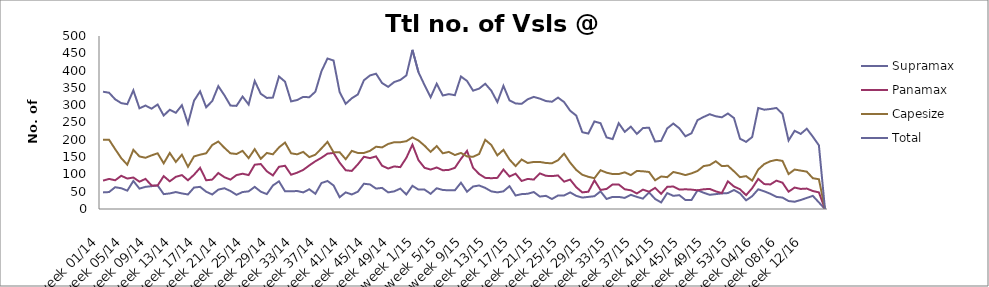
| Category | Supramax | Panamax | Capesize | Total |
|---|---|---|---|---|
| week 01/14 | 48 | 82 | 200 | 339 |
| week 02/14 | 49 | 87 | 200 | 336 |
| week 03/14 | 63 | 83 | 173 | 317 |
| week 04/14 | 60 | 96 | 147 | 306 |
| week 05/14 | 53 | 88 | 128 | 303 |
| week 06/14 | 81 | 91 | 171 | 343 |
| week 07/14 | 59 | 79 | 152 | 291 |
| week 08/14 | 64 | 87 | 148 | 299 |
| week 09/14 | 66 | 68 | 155 | 290 |
| week 10/14 | 68 | 68 | 161 | 302 |
| week 11/14 | 43 | 95 | 132 | 270 |
| week 12/14 | 45 | 80 | 162 | 287 |
| week 13/14 | 49 | 93 | 136 | 278 |
| week 14/14 | 45 | 98 | 157 | 300 |
| week 15/14 | 42 | 83 | 122 | 247 |
| week 16/14 | 62 | 99 | 152 | 313 |
| week 17/14 | 64 | 119 | 157 | 340 |
| week 18/14 | 50 | 83 | 161 | 294 |
| week 19/14 | 42 | 85 | 185 | 312 |
| week 20/14 | 56 | 104 | 195 | 355 |
| week 21/14 | 60 | 92 | 177 | 329 |
| week 22/14 | 52 | 85 | 161 | 299 |
| week 23/14 | 41 | 98 | 159 | 298 |
| week 24/14 | 49 | 102 | 168 | 325 |
| week 25/14 | 51 | 98 | 147 | 302 |
| week 26/14 | 64 | 128 | 173 | 370 |
| week 27/14 | 50 | 130 | 145 | 333 |
| week 28/14 | 43 | 109 | 162 | 321 |
| week 29/14 | 68 | 97 | 158 | 322 |
| week 30/14 | 80 | 122 | 178 | 383 |
| week 31/14 | 51 | 125 | 192 | 368 |
| week 32/14 | 51 | 99 | 161 | 311 |
| week 33/14 | 52 | 105 | 158 | 315 |
| week 34/14 | 48 | 113 | 165 | 324 |
| week 35/14 | 57 | 126 | 150 | 323 |
| week 36/14 | 44 | 138 | 157 | 339 |
| week 37/14 | 75 | 148 | 175 | 398 |
| week 38/14 | 81 | 160 | 194 | 435 |
| week 39/14 | 68 | 162 | 164 | 429 |
| week 40/14 | 34 | 134 | 164 | 338 |
| week 41/14 | 48 | 112 | 144 | 304 |
| week 42/14 | 42 | 110 | 168 | 320 |
| week 43/14 | 50 | 129 | 162 | 331 |
| week 44/14 | 73 | 151 | 162 | 372 |
| week 45/14 | 71 | 147 | 168 | 386 |
| week 46/14 | 59 | 152 | 180 | 391 |
| week 47/14 | 61 | 125 | 178 | 364 |
| week 48/14 | 48 | 117 | 188 | 353 |
| week 49/14 | 51 | 123 | 193 | 367 |
| week 50/14 | 59 | 121 | 193 | 373 |
| week 51/14 | 42 | 148 | 196 | 386 |
| week 52/14 | 67 | 186 | 207 | 460 |
| week 1/15 | 56 | 141 | 198 | 395 |
| week 2/15 | 56 | 119 | 183 | 358 |
| week 3/15 | 44 | 114 | 165 | 323 |
| week 4/15 | 60 | 120 | 182 | 362 |
| week 5/15 | 55 | 112 | 161 | 328 |
| week 6/15 | 54 | 113 | 165 | 332 |
| week 7/15 | 54 | 119 | 156 | 329 |
| week 8/15 | 76 | 145 | 162 | 383 |
| week 9/15 | 50 | 168 | 152 | 370 |
| week 10/15 | 65 | 119 | 151 | 342 |
| week 11/15 | 68 | 101 | 159 | 348 |
| week 12/15 | 61 | 90 | 200 | 362 |
| week 13/15 | 51 | 89 | 185 | 342 |
| week 14/15 | 48 | 90 | 155 | 309 |
| week 15/15 | 51 | 114 | 171 | 356 |
| week 16/15 | 66 | 94 | 143 | 314 |
| week 17/15 | 39 | 102 | 124 | 305 |
| week 18/15 | 43 | 81 | 143 | 304 |
| week 19/15 | 44 | 87 | 133 | 317 |
| week 20/15 | 49 | 85 | 136 | 324 |
| week 21/15 | 36 | 103 | 136 | 319 |
| week 22/15 | 38 | 96 | 133 | 312 |
| week 23/15 | 29 | 95 | 132 | 310 |
| week 24/15 | 39 | 97 | 141 | 322 |
| week 25/15 | 39 | 79 | 160 | 309 |
| week 26/15 | 48 | 85 | 134 | 284 |
| week 27/15 | 38 | 63 | 113 | 270 |
| week 28/15 | 33 | 48 | 99 | 222 |
| week 29/15 | 35 | 50 | 93 | 218 |
| week 30/15 | 37 | 83 | 89 | 253 |
| week 31/15 | 51 | 55 | 112 | 248 |
| week 32/15 | 29 | 58 | 105 | 207 |
| week 33/15 | 35 | 71 | 101 | 202 |
| week 34/15 | 35 | 71 | 101 | 248 |
| week 35/15 | 32 | 57 | 106 | 223 |
| week 36/15 | 41 | 54 | 98 | 238 |
| week 37/15 | 35 | 45 | 110 | 217 |
| week 38/15 | 30 | 56 | 109 | 234 |
| week 39/15 | 48 | 50 | 107 | 235 |
| week 40/15 | 29 | 61 | 83 | 195 |
| week 41/15 | 19 | 44 | 94 | 197 |
| week 42/15 | 46 | 64 | 92 | 233 |
| week 43/15 | 38 | 65 | 107 | 247 |
| week 44/15 | 40 | 56 | 103 | 233 |
| week 45/15 | 26 | 57 | 98 | 210 |
| week 46/15 | 26 | 56 | 103 | 219 |
| week 47/15 | 54 | 54 | 110 | 257 |
| week 48/15 | 47 | 57 | 124 | 266 |
| week 49/15 | 41 | 58 | 127 | 274 |
| week 50/15 | 43 | 51 | 138 | 268 |
| week 51/15 | 45 | 46 | 124 | 265 |
| week 52/15 | 46 | 80 | 125 | 276 |
| week 53/15 | 55 | 65 | 109 | 263 |
| week 01/16 | 45 | 57 | 92 | 203 |
| week 02/16 | 25 | 40 | 95 | 194 |
| week 03/16 | 37 | 60 | 82 | 208 |
| week 04/16 | 57 | 87 | 114 | 292 |
| week 05/16 | 51 | 72 | 130 | 287 |
| week 06/16 | 44 | 71 | 138 | 289 |
| week 07/16 | 35 | 82 | 142 | 292 |
| week 08/16 | 33 | 76 | 139 | 275 |
| week 09/16 | 23 | 50 | 101 | 198 |
| week 10/16 | 21 | 62 | 114 | 226 |
| week 11/16 | 26 | 58 | 111 | 217 |
| week 12/16 | 32 | 59 | 108 | 232 |
| week 13/16 | 38 | 52 | 89 | 209 |
| week 14/16 | 19 | 48 | 86 | 184 |